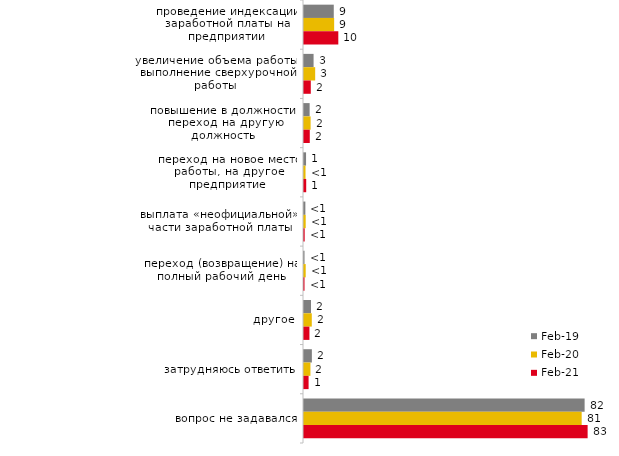
| Category | фев.19 | фев.20 | фев.21 |
|---|---|---|---|
| проведение индексации заработной платы на предприятии | 8.7 | 8.812 | 10.025 |
| увеличение объема работы, выполнение сверхурочной работы | 2.8 | 3.267 | 1.985 |
| повышение в должности, переход на другую должность | 1.65 | 1.931 | 1.687 |
| переход на новое место работы, на другое предприятие | 0.6 | 0.446 | 0.645 |
| выплата «неофициальной» части заработной платы | 0.4 | 0.495 | 0.199 |
| переход (возвращение) на полный рабочий день | 0.15 | 0.495 | 0.149 |
| другое | 2.05 | 2.277 | 1.588 |
| затрудняюсь ответить | 2.3 | 1.881 | 1.34 |
| вопрос не задавался | 82 | 81.139 | 82.878 |